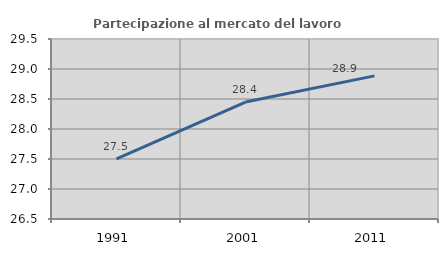
| Category | Partecipazione al mercato del lavoro  femminile |
|---|---|
| 1991.0 | 27.504 |
| 2001.0 | 28.449 |
| 2011.0 | 28.885 |